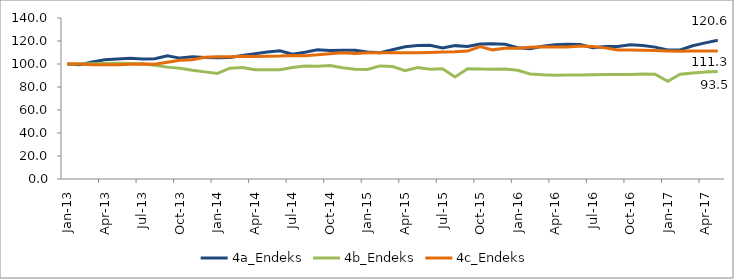
| Category | 4a_Endeks | 4b_Endeks | 4c_Endeks |
|---|---|---|---|
| 2013-01-01 | 100 | 100 | 100 |
| 2013-02-01 | 99.341 | 100.186 | 100.103 |
| 2013-03-01 | 101.699 | 100.316 | 99.376 |
| 2013-04-01 | 103.715 | 100.44 | 99.308 |
| 2013-05-01 | 104.428 | 100.593 | 99.354 |
| 2013-06-01 | 104.927 | 100.359 | 99.825 |
| 2013-07-01 | 104.291 | 100.235 | 100.034 |
| 2013-08-01 | 104.606 | 98.919 | 99.816 |
| 2013-09-01 | 107.058 | 97.279 | 101.465 |
| 2013-10-01 | 105.121 | 96.391 | 103.332 |
| 2013-11-01 | 106.291 | 94.505 | 103.676 |
| 2013-12-01 | 105.691 | 93.157 | 105.779 |
| 2014-01-01 | 105.394 | 91.809 | 106.405 |
| 2014-02-01 | 105.621 | 96.342 | 106.324 |
| 2014-03-01 | 107.422 | 96.881 | 106.808 |
| 2014-04-01 | 108.822 | 94.985 | 106.63 |
| 2014-05-01 | 110.468 | 94.991 | 106.797 |
| 2014-06-01 | 111.423 | 95.048 | 106.9 |
| 2014-07-01 | 108.578 | 97.037 | 107.377 |
| 2014-08-01 | 110.144 | 98.176 | 107.181 |
| 2014-09-01 | 112.457 | 98.105 | 107.944 |
| 2014-10-01 | 111.75 | 98.688 | 109.01 |
| 2014-11-01 | 111.99 | 96.8 | 109.792 |
| 2014-12-01 | 111.927 | 95.408 | 109.034 |
| 2015-01-01 | 110.39 | 95.212 | 109.696 |
| 2015-02-01 | 109.858 | 98.341 | 109.798 |
| 2015-03-01 | 112.398 | 97.783 | 109.691 |
| 2015-04-01 | 114.992 | 94.11 | 109.772 |
| 2015-05-01 | 116.136 | 97.001 | 109.771 |
| 2015-06-01 | 116.229 | 95.486 | 110.077 |
| 2015-07-01 | 113.85 | 95.779 | 110.496 |
| 2015-08-01 | 115.972 | 88.733 | 110.564 |
| 2015-09-01 | 115.313 | 95.871 | 111.229 |
| 2015-10-01 | 117.465 | 95.632 | 115.106 |
| 2015-11-01 | 117.589 | 95.515 | 112.299 |
| 2015-12-01 | 117.231 | 95.591 | 113.643 |
| 2016-01-01 | 114.144 | 94.602 | 113.723 |
| 2016-02-01 | 113.342 | 91.378 | 114.666 |
| 2016-03-01 | 115.432 | 90.561 | 115.02 |
| 2016-04-01 | 116.822 | 90.152 | 114.769 |
| 2016-05-01 | 117.084 | 90.532 | 114.842 |
| 2016-06-01 | 117 | 90.422 | 115.564 |
| 2016-07-01 | 114.224 | 90.567 | 115.133 |
| 2016-08-01 | 115.159 | 90.767 | 114.028 |
| 2016-09-01 | 115.153 | 90.854 | 112.174 |
| 2016-10-01 | 116.776 | 90.934 | 112.226 |
| 2016-11-01 | 116.121 | 91.325 | 111.9 |
| 2016-12-01 | 114.684 | 91.154 | 111.757 |
| 2017-01-01 | 112.121 | 85.031 | 111.361 |
| 2017-02-01 | 112.207 | 91.066 | 111.141 |
| 2017-03-01 | 115.907 | 92.252 | 111.35 |
| 2017-04-01 | 118.39 | 93.129 | 111.317 |
| 2017-05-01 | 120.58 | 93.519 | 111.341 |